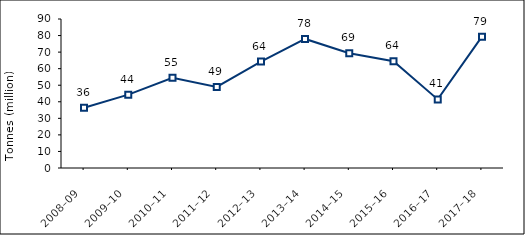
| Category | Total rubber |
|---|---|
| 2008–09 | 36391 |
| 2009–10 | 44320 |
| 2010–11 | 54515 |
| 2011–12 | 48974 |
| 2012–13 | 64255 |
| 2013–14 | 77954 |
| 2014–15 | 69348 |
| 2015–16 | 64452 |
| 2016–17 | 41438 |
| 2017–18 | 79350 |